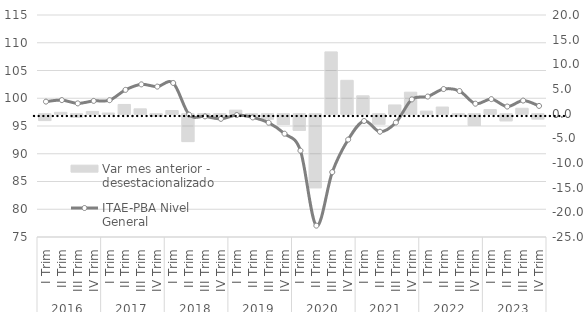
| Category | Var mes anterior - desestacionalizado |
|---|---|
| 0 | -1.293 |
| 1 | 0.274 |
| 2 | -0.593 |
| 3 | 0.452 |
| 4 | 0.13 |
| 5 | 1.863 |
| 6 | 0.979 |
| 7 | -0.394 |
| 8 | 0.639 |
| 9 | -5.554 |
| 10 | -0.318 |
| 11 | -0.464 |
| 12 | 0.711 |
| 13 | -0.441 |
| 14 | -0.991 |
| 15 | -2.066 |
| 16 | -3.264 |
| 17 | -14.922 |
| 18 | 12.521 |
| 19 | 6.76 |
| 20 | 3.622 |
| 21 | -2.02 |
| 22 | 1.767 |
| 23 | 4.353 |
| 24 | 0.517 |
| 25 | 1.347 |
| 26 | -0.351 |
| 27 | -2.252 |
| 28 | 0.83 |
| 29 | -1.338 |
| 30 | 1.092 |
| 31 | -0.969 |